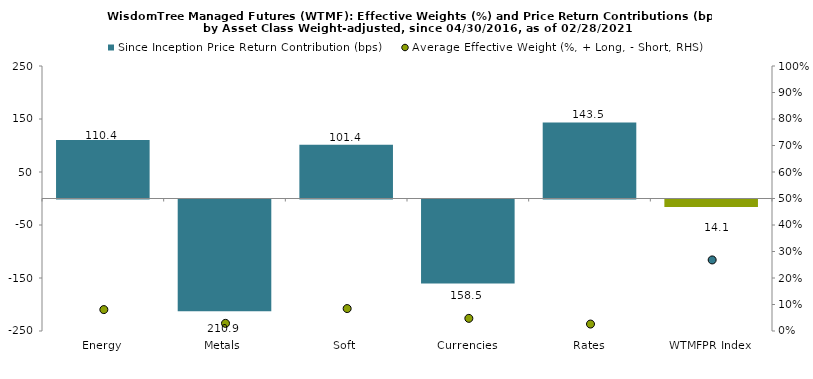
| Category | Since Inception Price Return Contribution (bps) |
|---|---|
| Energy | 110.441 |
| Metals | -210.942 |
| Soft | 101.428 |
| Currencies | -158.51 |
| Rates | 143.453 |
| WTMFPR Index | -14.13 |